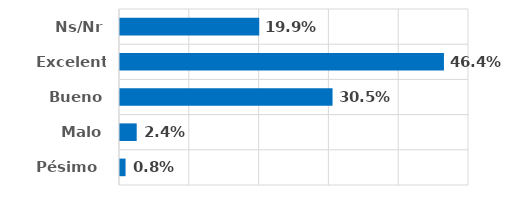
| Category | Series 0 |
|---|---|
| Pésimo  | 0.008 |
| Malo | 0.024 |
| Bueno | 0.305 |
| Excelente | 0.464 |
| Ns/Nr | 0.199 |